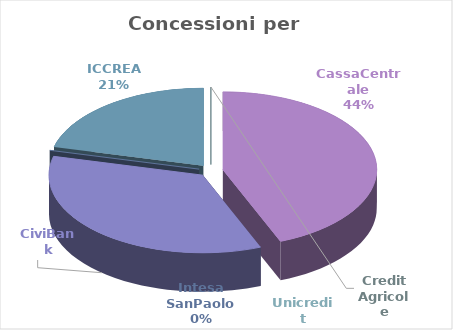
| Category | Series 0 |
|---|---|
| CassaCentrale | 11219000 |
| CiviBank | 8955654 |
| Intesa SanPaolo  | 0 |
| ICCREA | 5393000 |
| Unicredit | 0 |
| Credit Agricole | 0 |